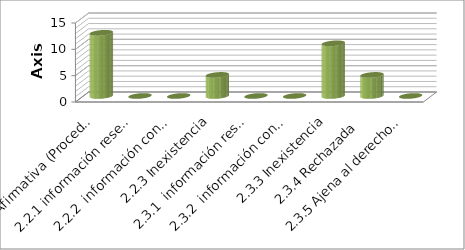
| Category | Series 0 |
|---|---|
| 2.1 Afirmativa (Procedente) | 12 |
| 2.2.1 información reservada | 0 |
| 2.2.2  información confidencial | 0 |
| 2.2.3 Inexistencia | 4 |
| 2.3.1  información reservada | 0 |
| 2.3.2  información confidencial | 0 |
| 2.3.3 Inexistencia | 10 |
| 2.3.4 Rechazada  | 4 |
| 2.3.5 Ajena al derecho de Inf. | 0 |